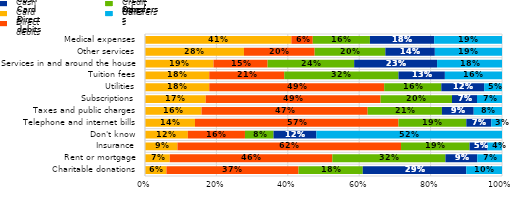
| Category | Cards | Direct debits | Credit transfers | Cash | Others |
|---|---|---|---|---|---|
| Charitable donations | 0.06 | 0.37 | 0.18 | 0.29 | 0.1 |
| Rent or mortgage | 0.07 | 0.46 | 0.32 | 0.09 | 0.07 |
| Insurance | 0.09 | 0.62 | 0.19 | 0.05 | 0.04 |
| Don't know | 0.12 | 0.16 | 0.08 | 0.12 | 0.52 |
| Telephone and internet bills | 0.14 | 0.57 | 0.19 | 0.07 | 0.03 |
| Taxes and public charges | 0.16 | 0.47 | 0.21 | 0.09 | 0.08 |
| Subscriptions | 0.17 | 0.49 | 0.2 | 0.07 | 0.07 |
| Utilities | 0.18 | 0.49 | 0.16 | 0.12 | 0.05 |
| Tuition fees | 0.18 | 0.21 | 0.32 | 0.13 | 0.16 |
| Services in and around the house | 0.19 | 0.15 | 0.24 | 0.23 | 0.18 |
| Other services | 0.28 | 0.2 | 0.2 | 0.14 | 0.19 |
| Medical expenses | 0.41 | 0.06 | 0.16 | 0.18 | 0.19 |